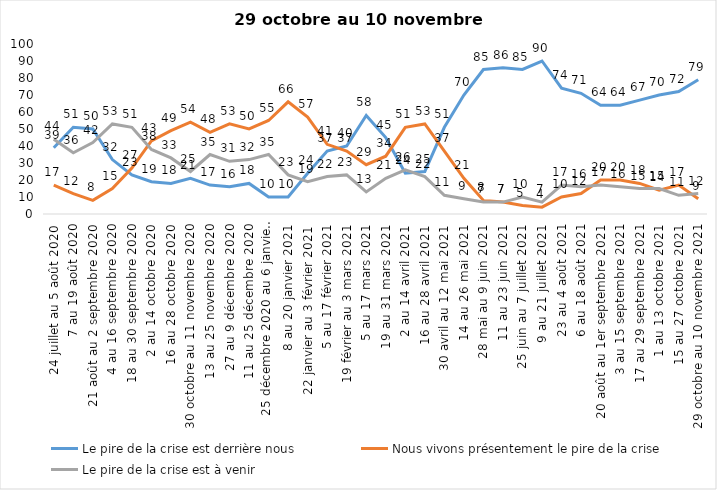
| Category | Le pire de la crise est derrière nous | Nous vivons présentement le pire de la crise | Le pire de la crise est à venir |
|---|---|---|---|
| 24 juillet au 5 août 2020 | 39 | 17 | 44 |
| 7 au 19 août 2020 | 51 | 12 | 36 |
| 21 août au 2 septembre 2020 | 50 | 8 | 42 |
| 4 au 16 septembre 2020 | 32 | 15 | 53 |
| 18 au 30 septembre 2020 | 23 | 27 | 51 |
| 2 au 14 octobre 2020 | 19 | 43 | 38 |
| 16 au 28 octobre 2020 | 18 | 49 | 33 |
| 30 octobre au 11 novembre 2020 | 21 | 54 | 25 |
| 13 au 25 novembre 2020 | 17 | 48 | 35 |
| 27 au 9 décembre 2020 | 16 | 53 | 31 |
| 11 au 25 décembre 2020 | 18 | 50 | 32 |
| 25 décembre 2020 au 6 janvier 2021 | 10 | 55 | 35 |
| 8 au 20 janvier 2021 | 10 | 66 | 23 |
| 22 janvier au 3 février 2021 | 24 | 57 | 19 |
| 5 au 17 février 2021 | 37 | 41 | 22 |
| 19 février au 3 mars 2021 | 40 | 37 | 23 |
| 5 au 17 mars 2021 | 58 | 29 | 13 |
| 19 au 31 mars 2021 | 45 | 34 | 21 |
| 2 au 14 avril 2021 | 24 | 51 | 26 |
| 16 au 28 avril 2021 | 25 | 53 | 22 |
| 30 avril au 12 mai 2021 | 51 | 37 | 11 |
| 14 au 26 mai 2021 | 70 | 21 | 9 |
| 28 mai au 9 juin 2021 | 85 | 8 | 7 |
| 11 au 23 juin 2021 | 86 | 7 | 7 |
| 25 juin au 7 juillet 2021 | 85 | 5 | 10 |
| 9 au 21 juillet 2021 | 90 | 4 | 7 |
| 23 au 4 août 2021 | 74 | 10 | 17 |
| 6 au 18 août 2021 | 71 | 12 | 16 |
| 20 août au 1er septembre 2021 | 64 | 20 | 17 |
| 3 au 15 septembre 2021 | 64 | 20 | 16 |
| 17 au 29 septembre 2021 | 67 | 18 | 15 |
| 1 au 13 octobre 2021 | 70 | 14 | 15 |
| 15 au 27 octobre 2021 | 72 | 17 | 11 |
| 29 octobre au 10 novembre 2021 | 79 | 9 | 12 |